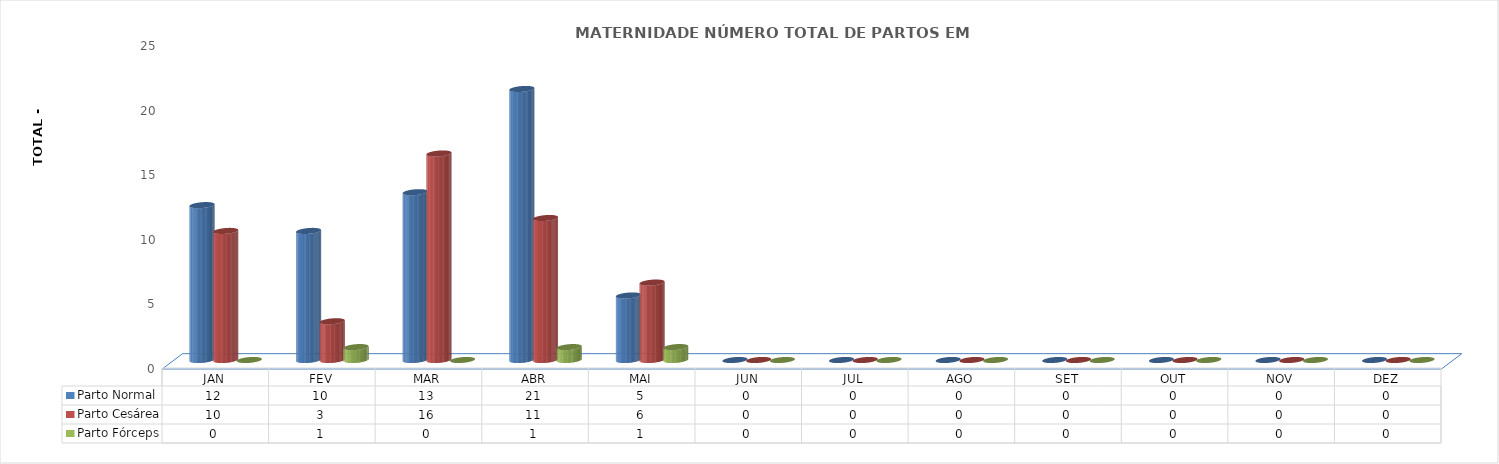
| Category | Parto Normal | Parto Cesárea | Parto Fórceps |
|---|---|---|---|
| JAN | 12 | 10 | 0 |
| FEV | 10 | 3 | 1 |
| MAR | 13 | 16 | 0 |
| ABR | 21 | 11 | 1 |
| MAI | 5 | 6 | 1 |
| JUN | 0 | 0 | 0 |
| JUL | 0 | 0 | 0 |
| AGO | 0 | 0 | 0 |
| SET | 0 | 0 | 0 |
| OUT | 0 | 0 | 0 |
| NOV | 0 | 0 | 0 |
| DEZ | 0 | 0 | 0 |